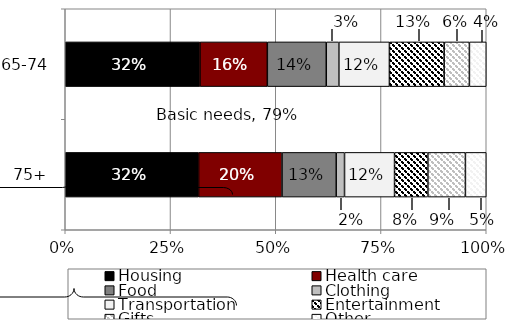
| Category | Housing | Health care | Food | Clothing | Transportation | Entertainment | Gifts  | Other |
|---|---|---|---|---|---|---|---|---|
| 75+ | 0.32 | 0.2 | 0.13 | 0.02 | 0.12 | 0.08 | 0.09 | 0.05 |
| 65-74 | 0.32 | 0.16 | 0.14 | 0.03 | 0.12 | 0.13 | 0.06 | 0.04 |